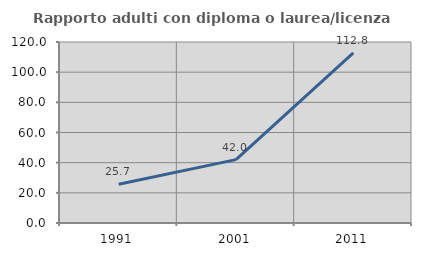
| Category | Rapporto adulti con diploma o laurea/licenza media  |
|---|---|
| 1991.0 | 25.714 |
| 2001.0 | 42 |
| 2011.0 | 112.821 |